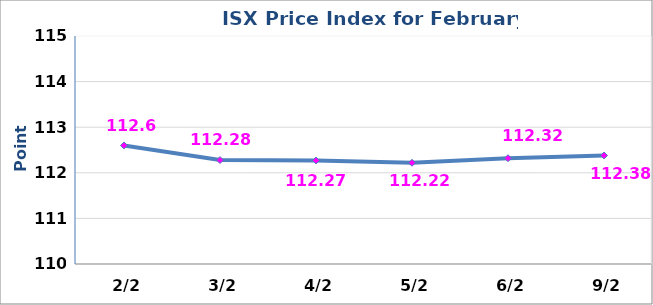
| Category | 2014 |
|---|---|
|  2/2 | 112.6 |
|  3/2 | 112.28 |
|  4/2 | 112.27 |
|  5/2 | 112.22 |
|  6/2 | 112.32 |
|  9/2 | 112.38 |